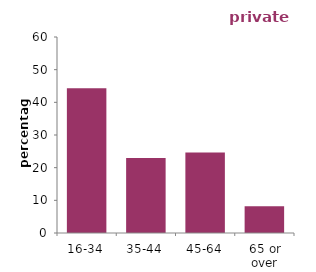
| Category |  private renters |
|---|---|
| 16-34 | 44.302 |
| 35-44 | 22.923 |
| 45-64 | 24.61 |
| 65 or over | 8.165 |